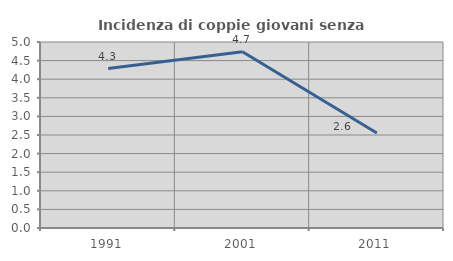
| Category | Incidenza di coppie giovani senza figli |
|---|---|
| 1991.0 | 4.286 |
| 2001.0 | 4.739 |
| 2011.0 | 2.553 |